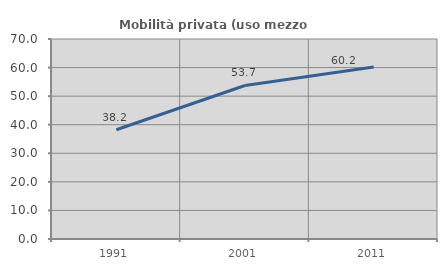
| Category | Mobilità privata (uso mezzo privato) |
|---|---|
| 1991.0 | 38.224 |
| 2001.0 | 53.734 |
| 2011.0 | 60.163 |